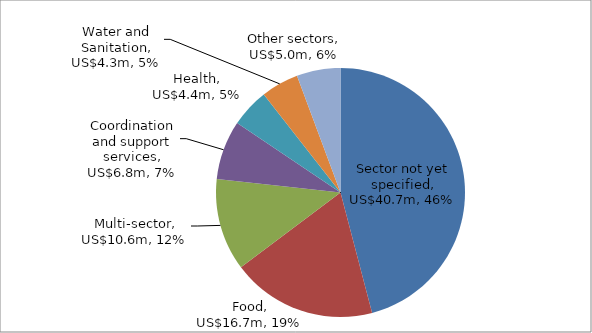
| Category | US$ millions |
|---|---|
| Sector not yet specified | 40.711 |
| Food | 16.698 |
| Multi-sector | 10.631 |
| Coordination and support services | 6.809 |
| Health | 4.45 |
| Water and Sanitation | 4.329 |
| Other sectors | 5.037 |